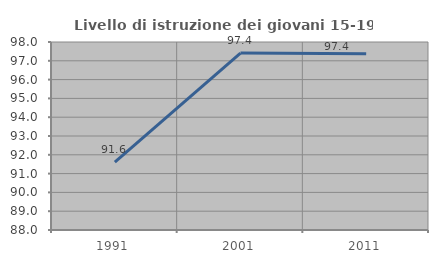
| Category | Livello di istruzione dei giovani 15-19 anni |
|---|---|
| 1991.0 | 91.613 |
| 2001.0 | 97.414 |
| 2011.0 | 97.368 |